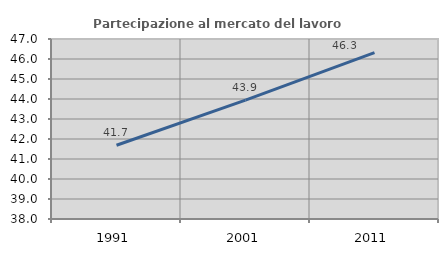
| Category | Partecipazione al mercato del lavoro  femminile |
|---|---|
| 1991.0 | 41.687 |
| 2001.0 | 43.941 |
| 2011.0 | 46.315 |